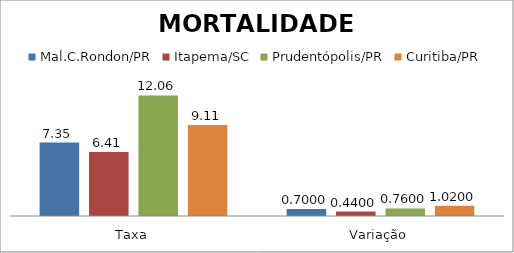
| Category | Mal.C.Rondon/PR | Itapema/SC | Prudentópolis/PR | Toledo/PR | Cascavel/PR | Curitiba/PR |
|---|---|---|---|---|---|---|
| Taxa | 7.35 | 6.41 | 12.06 |  |  | 9.11 |
| Variação | 0.7 | 0.44 | 0.76 |  |  | 1.02 |